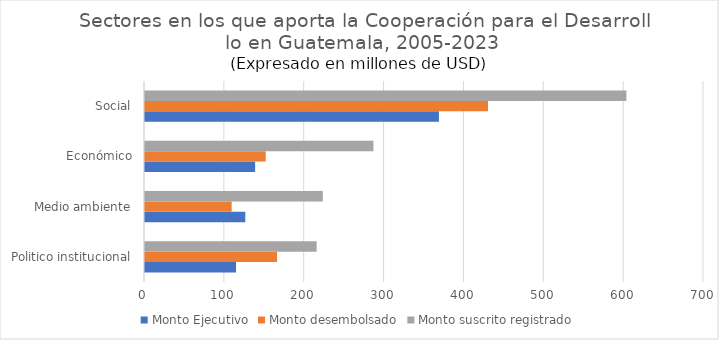
| Category | Monto Ejecutivo | Monto desembolsado | Monto suscrito registrado |
|---|---|---|---|
| Politico institucional | 114 | 165.42 | 214.92 |
| Medio ambiente | 125.59 | 108.51 | 222.65 |
| Económico | 137.91 | 151.13 | 286.02 |
| Social | 368.08 | 429.55 | 602.83 |